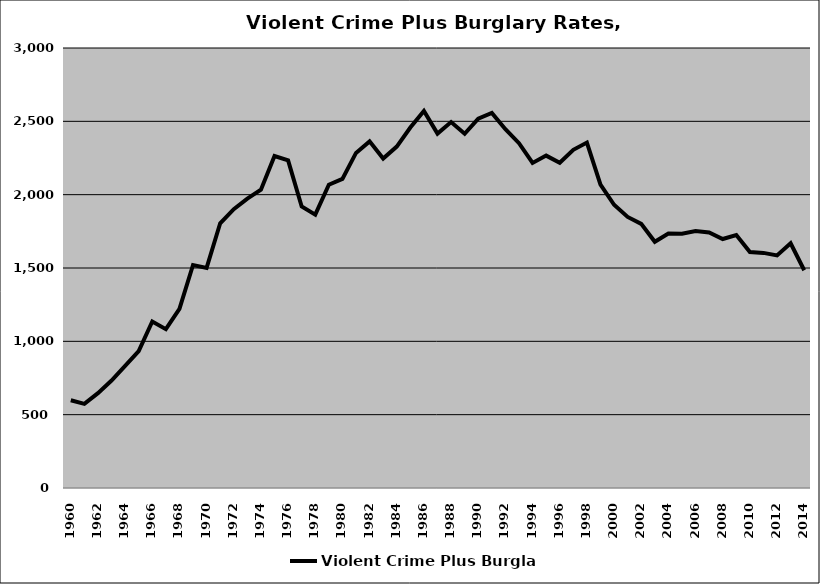
| Category | Violent Crime Plus Burglary |
|---|---|
| 1960.0 | 598.408 |
| 1961.0 | 573.245 |
| 1962.0 | 646.471 |
| 1963.0 | 732.417 |
| 1964.0 | 832.837 |
| 1965.0 | 933.916 |
| 1966.0 | 1135.127 |
| 1967.0 | 1083.151 |
| 1968.0 | 1220.788 |
| 1969.0 | 1520.624 |
| 1970.0 | 1500.886 |
| 1971.0 | 1804.854 |
| 1972.0 | 1901.221 |
| 1973.0 | 1972.875 |
| 1974.0 | 2033.422 |
| 1975.0 | 2263.47 |
| 1976.0 | 2233.904 |
| 1977.0 | 1919.58 |
| 1978.0 | 1863.861 |
| 1979.0 | 2067.446 |
| 1980.0 | 2107.491 |
| 1981.0 | 2284.702 |
| 1982.0 | 2363.282 |
| 1983.0 | 2245.961 |
| 1984.0 | 2327.739 |
| 1985.0 | 2457.862 |
| 1986.0 | 2570.25 |
| 1987.0 | 2416.133 |
| 1988.0 | 2495.033 |
| 1989.0 | 2414.987 |
| 1990.0 | 2518.961 |
| 1991.0 | 2557.752 |
| 1992.0 | 2446.363 |
| 1993.0 | 2350.866 |
| 1994.0 | 2216.022 |
| 1995.0 | 2266.291 |
| 1996.0 | 2217.455 |
| 1997.0 | 2305.665 |
| 1998.0 | 2355.383 |
| 1999.0 | 2069.209 |
| 2000.0 | 1930.957 |
| 2001.0 | 1848.236 |
| 2002.0 | 1800.875 |
| 2003.0 | 1678.518 |
| 2004.0 | 1734.361 |
| 2005.0 | 1733.503 |
| 2006.0 | 1752.431 |
| 2007.0 | 1742.055 |
| 2008.0 | 1697.736 |
| 2009.0 | 1724.859 |
| 2010.0 | 1609.379 |
| 2011.0 | 1603.089 |
| 2012.0 | 1585.955 |
| 2013.0 | 1668.412 |
| 2014.0 | 1484.677 |